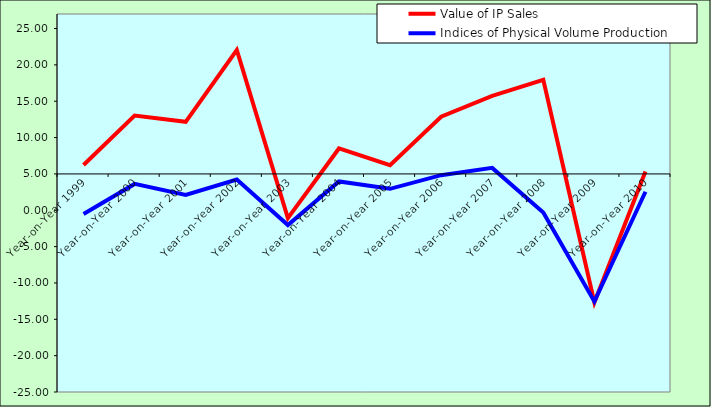
| Category | Value of IP Sales | Indices of Physical Volume Production |
|---|---|---|
| Year-on-Year 1999 | 6.23 | -0.508 |
| Year-on-Year 2000 | 13.031 | 3.625 |
| Year-on-Year 2001 | 12.168 | 2.121 |
| Year-on-Year 2002 | 22.052 | 4.237 |
| Year-on-Year 2003 | -1.087 | -2.028 |
| Year-on-Year 2004 | 8.504 | 3.97 |
| Year-on-Year 2005 | 6.21 | 2.952 |
| Year-on-Year 2006 | 12.874 | 4.826 |
| Year-on-Year 2007 | 15.741 | 5.83 |
| Year-on-Year 2008 | 17.937 | -0.302 |
| Year-on-Year 2009 | -12.692 | -12.555 |
| Year-on-Year 2010 | 5.328 | 2.547 |